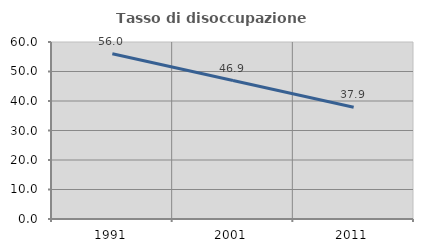
| Category | Tasso di disoccupazione giovanile  |
|---|---|
| 1991.0 | 56.044 |
| 2001.0 | 46.939 |
| 2011.0 | 37.903 |